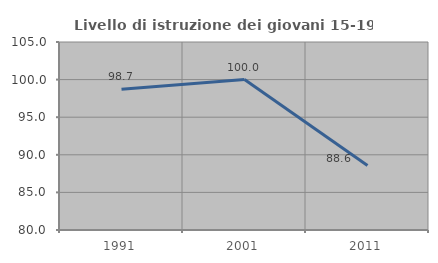
| Category | Livello di istruzione dei giovani 15-19 anni |
|---|---|
| 1991.0 | 98.718 |
| 2001.0 | 100 |
| 2011.0 | 88.571 |